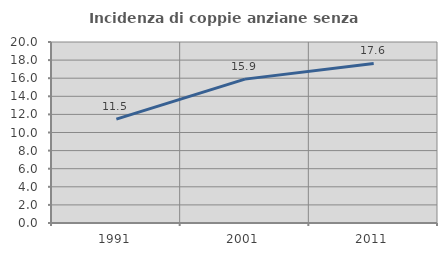
| Category | Incidenza di coppie anziane senza figli  |
|---|---|
| 1991.0 | 11.477 |
| 2001.0 | 15.898 |
| 2011.0 | 17.625 |